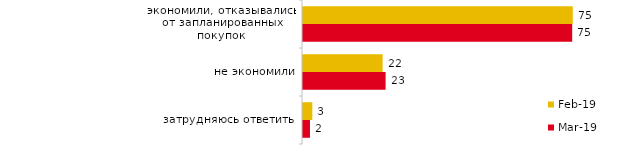
| Category | фев.19 | мар.19 |
|---|---|---|
| экономили, отказывались от запланированных покупок | 75.2 | 75.037 |
| не экономили | 22.2 | 23.023 |
| затрудняюсь ответить | 2.6 | 1.939 |